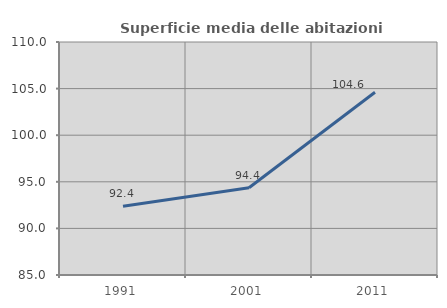
| Category | Superficie media delle abitazioni occupate |
|---|---|
| 1991.0 | 92.379 |
| 2001.0 | 94.367 |
| 2011.0 | 104.601 |